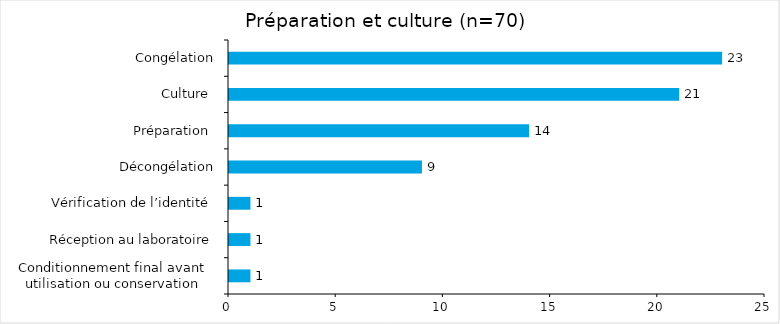
| Category | Series 0 |
|---|---|
| Conditionnement final avant 
utilisation ou conservation  | 1 |
| Réception au laboratoire | 1 |
| Vérification de l’identité  | 1 |
| Décongélation | 9 |
| Préparation  | 14 |
| Culture  | 21 |
| Congélation | 23 |